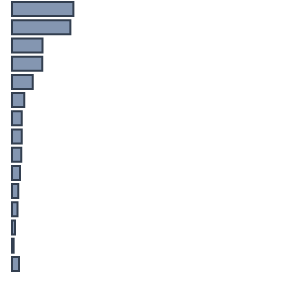
| Category | Series 0 |
|---|---|
| 0 | 22.4 |
| 1 | 21.3 |
| 2 | 11.1 |
| 3 | 11 |
| 4 | 7.6 |
| 5 | 4.5 |
| 6 | 3.6 |
| 7 | 3.6 |
| 8 | 3.4 |
| 9 | 2.9 |
| 10 | 2.3 |
| 11 | 2 |
| 12 | 1.1 |
| 13 | 0.6 |
| 14 | 2.6 |